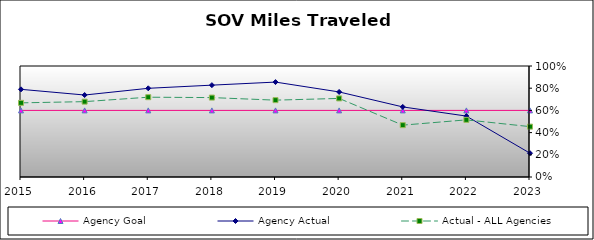
| Category | Agency Goal | Agency Actual | Actual - ALL Agencies |
|---|---|---|---|
| 2015.0 | 0.6 | 0.79 | 0.668 |
| 2016.0 | 0.6 | 0.738 | 0.679 |
| 2017.0 | 0.6 | 0.799 | 0.719 |
| 2018.0 | 0.6 | 0.828 | 0.715 |
| 2019.0 | 0.6 | 0.855 | 0.692 |
| 2020.0 | 0.6 | 0.766 | 0.708 |
| 2021.0 | 0.6 | 0.631 | 0.467 |
| 2022.0 | 0.6 | 0.549 | 0.515 |
| 2023.0 | 0.6 | 0.214 | 0.454 |